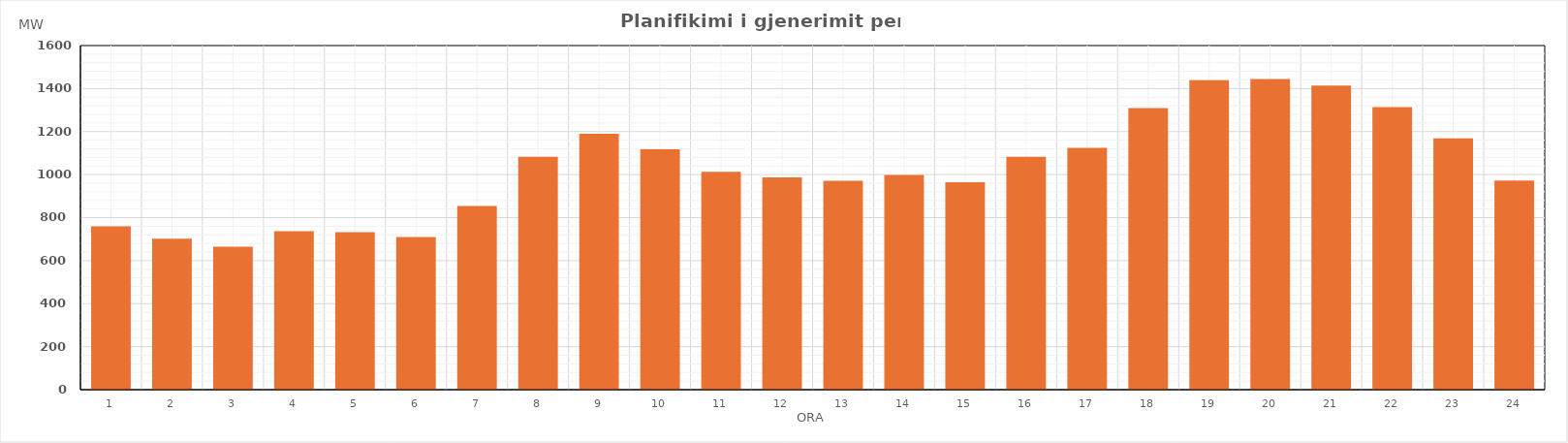
| Category | Max (MW) |
|---|---|
| 0 | 759.38 |
| 1 | 701.58 |
| 2 | 664.38 |
| 3 | 736.48 |
| 4 | 731.88 |
| 5 | 709.51 |
| 6 | 854.54 |
| 7 | 1082.42 |
| 8 | 1190.09 |
| 9 | 1118.26 |
| 10 | 1013.33 |
| 11 | 986.82 |
| 12 | 970.91 |
| 13 | 997.83 |
| 14 | 964.13 |
| 15 | 1083.37 |
| 16 | 1124.98 |
| 17 | 1309.78 |
| 18 | 1439.15 |
| 19 | 1444.97 |
| 20 | 1414.45 |
| 21 | 1313.28 |
| 22 | 1168.38 |
| 23 | 972.59 |